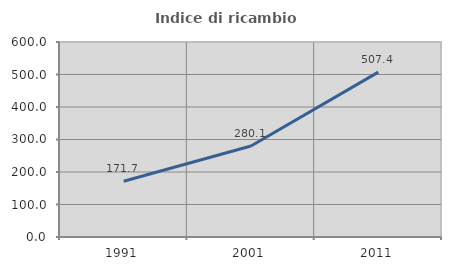
| Category | Indice di ricambio occupazionale  |
|---|---|
| 1991.0 | 171.681 |
| 2001.0 | 280.063 |
| 2011.0 | 507.424 |